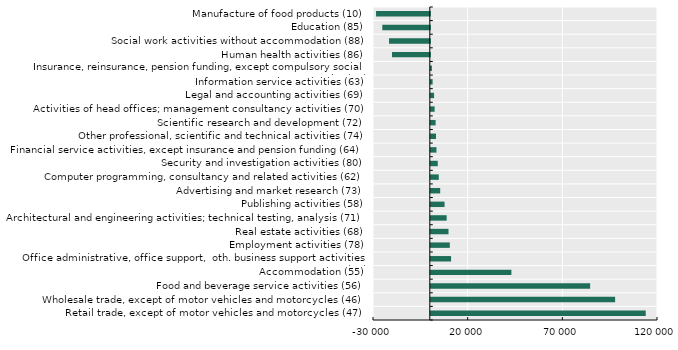
| Category | Series 0 |
|---|---|
| Retail trade, except of motor vehicles and motorcycles (47) | 113518.051 |
| Wholesale trade, except of motor vehicles and motorcycles (46) | 97355.431 |
| Food and beverage service activities (56) | 84153.32 |
| Accommodation (55) | 42569.096 |
| Office administrative, office support,  oth. business support activities (82) | 10706.302 |
| Employment activities (78) | 10038.868 |
| Real estate activities (68) | 9353.627 |
| Architectural and engineering activities; technical testing, analysis (71) | 8374.814 |
| Publishing activities (58) | 7269.154 |
| Advertising and market research (73) | 4952.911 |
| Computer programming, consultancy and related activities (62) | 4211.977 |
| Security and investigation activities (80) | 3679.44 |
| Financial service activities, except insurance and pension funding (64) | 2990.088 |
| Other professional, scientific and technical activities (74) | 2758.886 |
| Scientific research and development (72) | 2555.779 |
| Activities of head offices; management consultancy activities (70) | 2023.938 |
| Legal and accounting activities (69) | 1729.076 |
| Information service activities (63) | 958.509 |
| Insurance, reinsurance, pension funding, except compulsory social security (65) | 571.091 |
| Human health activities (86) | -19955.406 |
| Social work activities without accommodation (88) | -21539.948 |
| Education (85) | -25087.69 |
| Manufacture of food products (10) | -28394.493 |